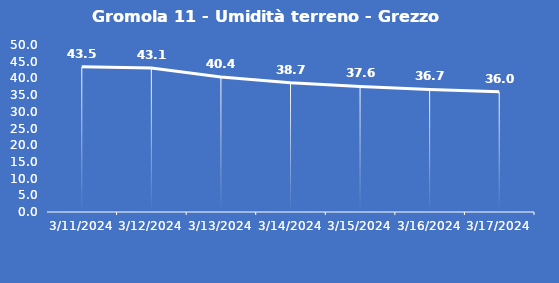
| Category | Gromola 11 - Umidità terreno - Grezzo (%VWC) |
|---|---|
| 3/11/24 | 43.5 |
| 3/12/24 | 43.1 |
| 3/13/24 | 40.4 |
| 3/14/24 | 38.7 |
| 3/15/24 | 37.6 |
| 3/16/24 | 36.7 |
| 3/17/24 | 36 |